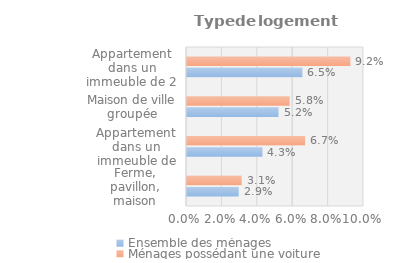
| Category | Ensemble des ménages | Ménages possédant une voiture |
|---|---|---|
| Ferme, pavillon, maison indépendante | 0.029 | 0.031 |
| Appartement dans un immeuble de 10 logements ou plus | 0.043 | 0.067 |
| Maison de ville groupée | 0.052 | 0.058 |
| Appartement dans un immeuble de 2 à 9 logements | 0.065 | 0.092 |